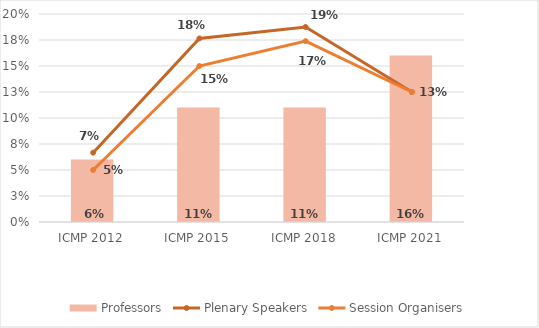
| Category | Professors |
|---|---|
| ICMP 2012 | 0.06 |
| ICMP 2015 | 0.11 |
| ICMP 2018 | 0.11 |
| ICMP 2021 | 0.16 |